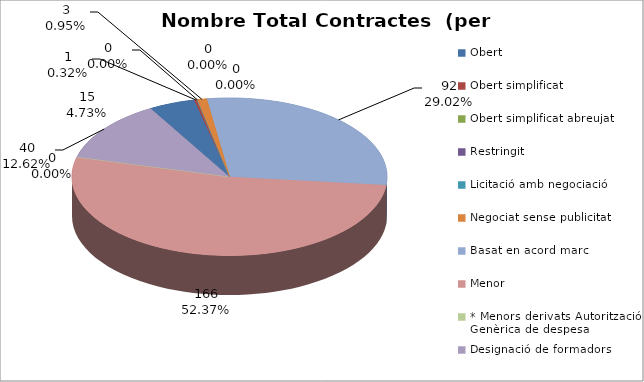
| Category | Nombre Total Contractes |
|---|---|
| Obert | 15 |
| Obert simplificat | 1 |
| Obert simplificat abreujat | 0 |
| Restringit | 0 |
| Licitació amb negociació | 0 |
| Negociat sense publicitat | 3 |
| Basat en acord marc | 92 |
| Menor | 166 |
| * Menors derivats Autorització Genèrica de despesa | 0 |
| Designació de formadors | 40 |